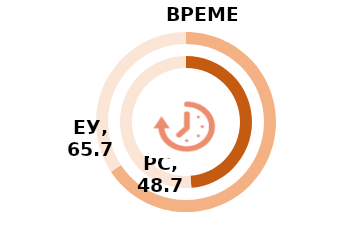
| Category | РС | Series 1 | ЕУ |
|---|---|---|---|
| Index | 48.7 |  | 65.7 |
| Rest | 51.3 |  | 34.3 |